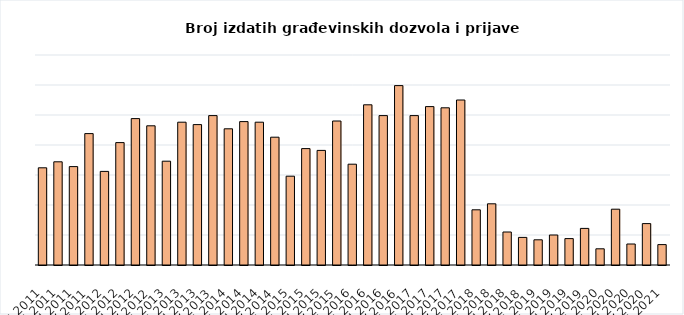
| Category | Broj izdatih građevinskih dozvola i prijava radova |
|---|---|
| I 2011 | 162 |
| II 2011 | 172 |
| III 2011 | 164 |
| IV 2011 | 219 |
| I 2012 | 156 |
| II 2012 | 204 |
| III 2012 | 244 |
| IV 2012 | 232 |
| I 2013 | 173 |
| II 2013 | 238 |
| III 2013 | 234 |
| IV 2013 | 249 |
| I 2014 | 227 |
| II 2014 | 239 |
| III 2014 | 238 |
| IV 2014 | 213 |
| I 2015 | 148 |
| II 2015 | 194 |
| III 2015 | 191 |
| IV 2015 | 240 |
| I 2016 | 168 |
| II 2016 | 267 |
| III 2016 | 249 |
| IV 2016 | 299 |
| I 2017 | 249 |
| II 2017 | 264 |
| III 2017 | 262 |
| IV 2017 | 275 |
| I 2018 | 92 |
| II 2018 | 102 |
| III 2018 | 55 |
| IV 2018 | 46 |
| I 2019 | 42 |
| II 2019 | 50 |
| III 2019 | 44 |
| IV 2019 | 61 |
| I 2020 | 27 |
| II 2020 | 93 |
| III 2020 | 35 |
| IV 2020 | 69 |
| I 2021 | 34 |